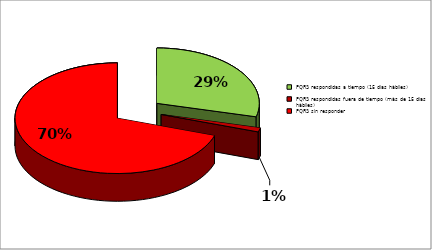
| Category | Series 0 |
|---|---|
| PQRS respondidas a tiempo (15 dìas hàbiles) | 0.289 |
| PQRS respondidas fuera de tiempo (màs de 15 dìas hàbiles) | 0.012 |
| PQRS sin responder | 0.699 |